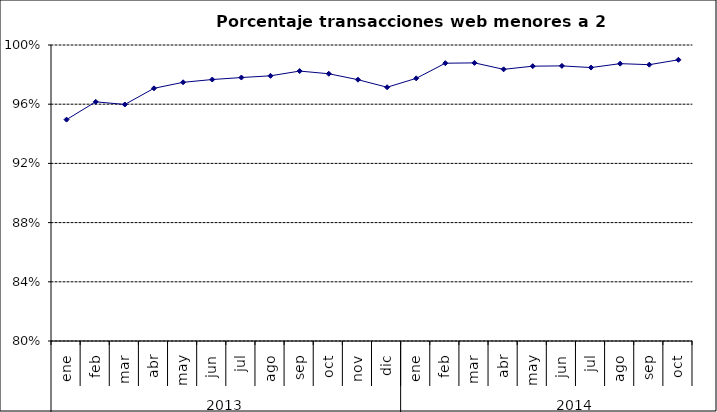
| Category | 94,96% 96,16% 95,98% 97,07% 97,48% 97,67% 97,80% 97,92% 98,24% 98,06% 97,66% 97,15% 97,75% 98,77% 98,79% 98,36% 98,57% 98,59% 98,48% 98,74% 98,67% 99,00% |
|---|---|
| 0 | 0.95 |
| 1 | 0.962 |
| 2 | 0.96 |
| 3 | 0.971 |
| 4 | 0.975 |
| 5 | 0.977 |
| 6 | 0.978 |
| 7 | 0.979 |
| 8 | 0.982 |
| 9 | 0.981 |
| 10 | 0.977 |
| 11 | 0.971 |
| 12 | 0.977 |
| 13 | 0.988 |
| 14 | 0.988 |
| 15 | 0.984 |
| 16 | 0.986 |
| 17 | 0.986 |
| 18 | 0.985 |
| 19 | 0.987 |
| 20 | 0.987 |
| 21 | 0.99 |